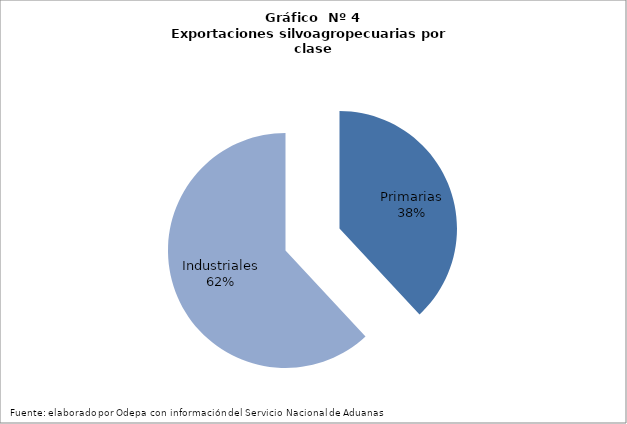
| Category | Series 0 |
|---|---|
| Primarias | 4663513 |
| Industriales | 7583132 |